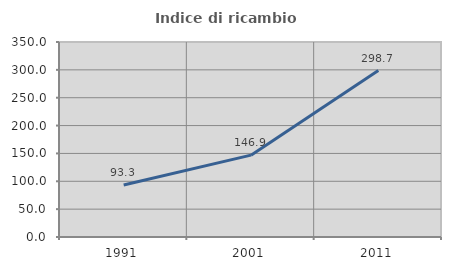
| Category | Indice di ricambio occupazionale  |
|---|---|
| 1991.0 | 93.289 |
| 2001.0 | 146.93 |
| 2011.0 | 298.73 |